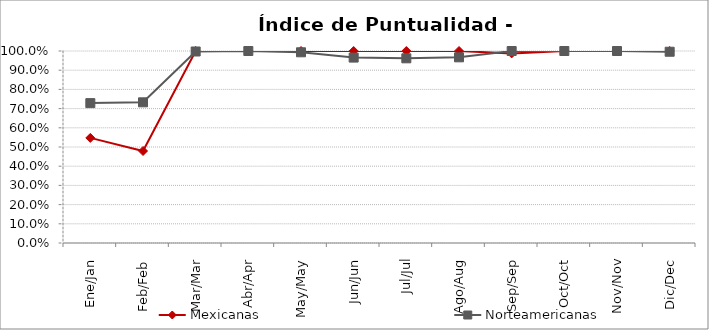
| Category | Mexicanas | Norteamericanas |
|---|---|---|
| Ene/Jan | 0.547 | 0.729 |
| Feb/Feb | 0.479 | 0.733 |
| Mar/Mar | 1 | 0.997 |
| Abr/Apr | 1 | 1 |
| May/May | 1 | 0.993 |
| Jun/Jun | 1 | 0.966 |
| Jul/Jul | 1 | 0.962 |
| Ago/Aug | 1 | 0.967 |
| Sep/Sep | 0.988 | 1 |
| Oct/Oct | 1 | 1 |
| Nov/Nov | 1 | 1 |
| Dic/Dec | 1 | 0.996 |